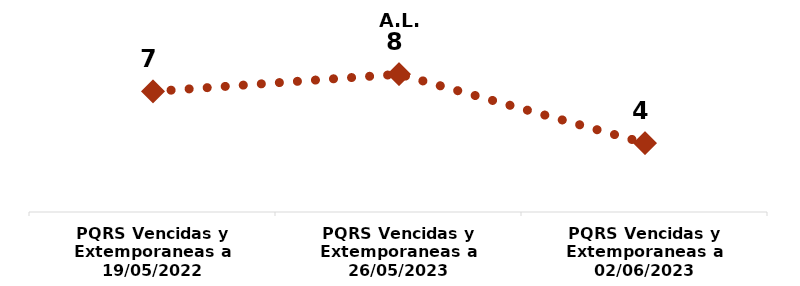
| Category | A.L. FONTIBÓN |
|---|---|
| PQRS Vencidas y Extemporaneas a 19/05/2022 | 7 |
| PQRS Vencidas y Extemporaneas a 26/05/2023 | 8 |
| PQRS Vencidas y Extemporaneas a 02/06/2023 | 4 |